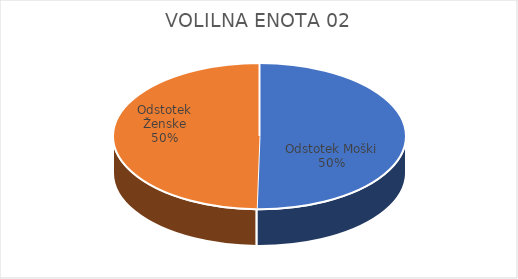
| Category | VOLILNA ENOTA 02 | #REF! | Slovenija skupaj |
|---|---|---|---|
| Odstotek Moški | 8.36 |  | 7.6 |
| Odstotek Ženske | 8.26 |  | 7.35 |